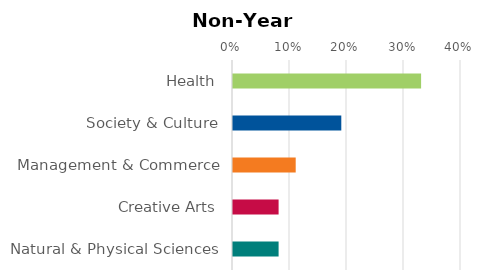
| Category | Series 0 |
|---|---|
| Health | 0.33 |
| Society & Culture | 0.19 |
| Management & Commerce | 0.11 |
| Creative Arts | 0.08 |
| Natural & Physical Sciences | 0.08 |